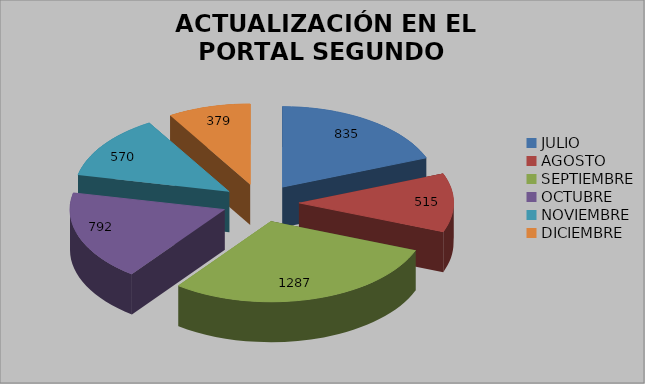
| Category |  ACTUALIZACIÓN EN EL PORTAL SEGUNDO SEMESTRE 2017 |
|---|---|
| JULIO | 835 |
| AGOSTO | 515 |
| SEPTIEMBRE | 1287 |
| OCTUBRE | 792 |
| NOVIEMBRE | 570 |
| DICIEMBRE | 379 |